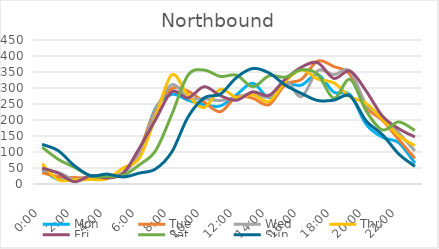
| Category | Mon | Tue | Wed | Thu | Fri | Sat | Sun |
|---|---|---|---|---|---|---|---|
| 0.0 | 45 | 35 | 43 | 63 | 50 | 115 | 124 |
| 0.041667 | 14 | 23 | 36 | 13 | 34 | 77 | 104 |
| 0.083333 | 15 | 20 | 14 | 13 | 7 | 52 | 57 |
| 0.125 | 14 | 20 | 24 | 14 | 26 | 25 | 26 |
| 0.166667 | 19 | 25 | 26 | 16 | 19 | 24 | 31 |
| 0.208333 | 35 | 35 | 35 | 50 | 33 | 27 | 22 |
| 0.25 | 100 | 106 | 94 | 81 | 112 | 60 | 34 |
| 0.291667 | 237 | 233 | 228 | 209 | 201 | 104 | 47 |
| 0.333333 | 280 | 298 | 310 | 341 | 288 | 217 | 100 |
| 0.375 | 262 | 290 | 269 | 278 | 269 | 340 | 209 |
| 0.416667 | 248 | 256 | 266 | 239 | 304 | 356 | 269 |
| 0.458333 | 244 | 226 | 261 | 296 | 276 | 336 | 281 |
| 0.5 | 279 | 273 | 270 | 270 | 262 | 340 | 333 |
| 0.541667 | 315 | 268 | 283 | 279 | 288 | 304 | 361 |
| 0.5833333333333334 | 270 | 248 | 272 | 258 | 277 | 338 | 347 |
| 0.625 | 311 | 311 | 323 | 320 | 327 | 334 | 309 |
| 0.666667 | 309 | 327 | 273 | 357 | 365 | 357 | 283 |
| 0.708333 | 342 | 384 | 354 | 328 | 379 | 343 | 261 |
| 0.75 | 287 | 367 | 342 | 316 | 330 | 268 | 262 |
| 0.791667 | 279 | 342 | 353 | 273 | 353 | 327 | 275 |
| 0.833333 | 186 | 240 | 248 | 252 | 290 | 228 | 197 |
| 0.875 | 146 | 199 | 211 | 202 | 212 | 169 | 154 |
| 0.916667 | 129 | 139 | 160 | 151 | 173 | 194 | 94 |
| 0.958333 | 65 | 80 | 103 | 120 | 147 | 167 | 55 |